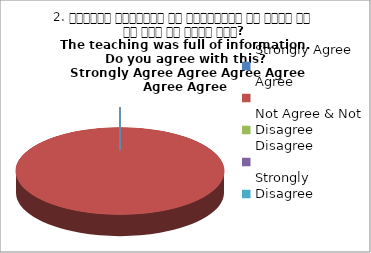
| Category | 2. शिक्षण जानकारी से परिपूर्ण था क्या आप इस बात से सहमत हैं?
The teaching was full of information. Do you agree with this?
 Strongly Agree Agree Agree Agree Agree Agree |
|---|---|
| Strongly Agree | 0 |
| Agree | 4 |
| Not Agree & Not Disagree | 0 |
| Disagree | 0 |
| Strongly Disagree | 0 |